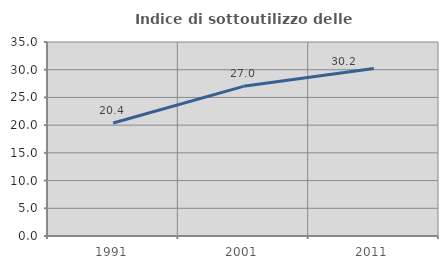
| Category | Indice di sottoutilizzo delle abitazioni  |
|---|---|
| 1991.0 | 20.382 |
| 2001.0 | 26.998 |
| 2011.0 | 30.205 |